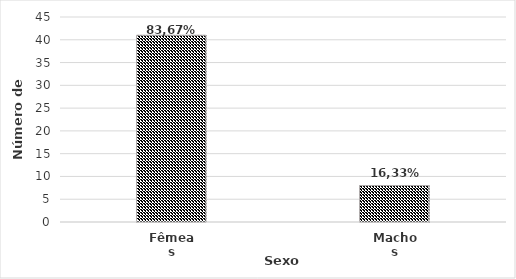
| Category | Número de Individuos |
|---|---|
| Fêmeas | 41 |
| Machos | 8 |